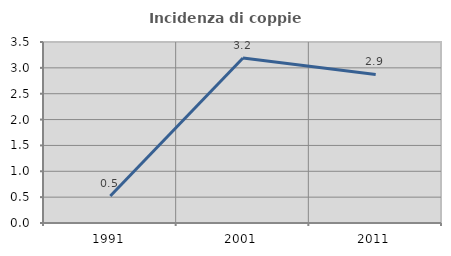
| Category | Incidenza di coppie miste |
|---|---|
| 1991.0 | 0.524 |
| 2001.0 | 3.191 |
| 2011.0 | 2.874 |